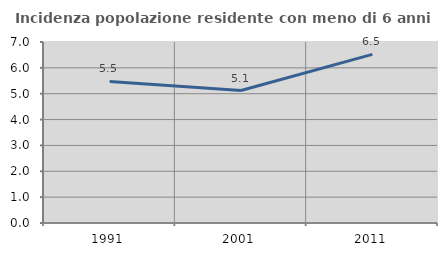
| Category | Incidenza popolazione residente con meno di 6 anni |
|---|---|
| 1991.0 | 5.474 |
| 2001.0 | 5.123 |
| 2011.0 | 6.52 |